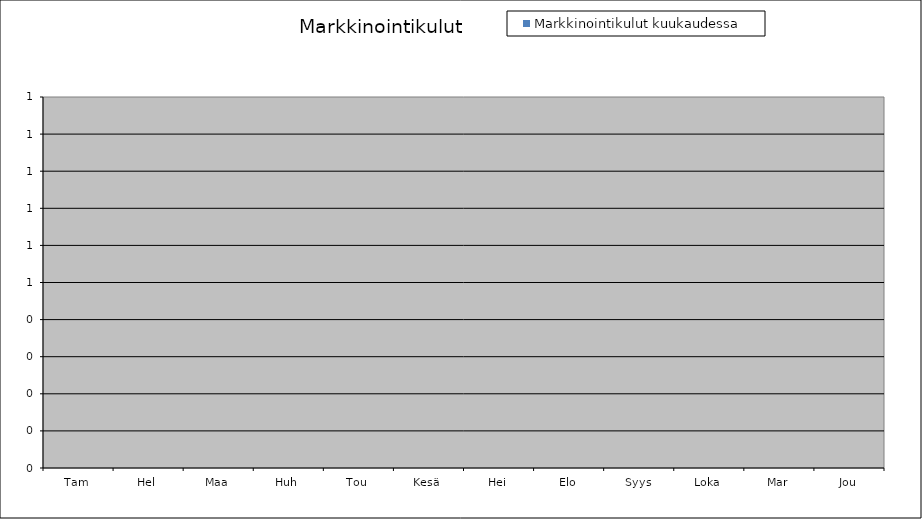
| Category | Markkinointikulut kuukaudessa |
|---|---|
| Tam | 0 |
| Hel | 0 |
| Maa | 0 |
| Huh | 0 |
| Tou | 0 |
| Kesä | 0 |
| Hei | 0 |
| Elo | 0 |
| Syys | 0 |
| Loka | 0 |
| Mar | 0 |
| Jou | 0 |